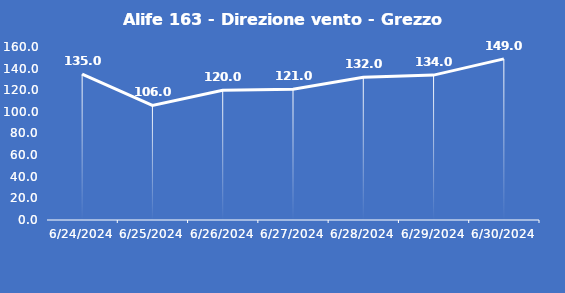
| Category | Alife 163 - Direzione vento - Grezzo (°N) |
|---|---|
| 6/24/24 | 135 |
| 6/25/24 | 106 |
| 6/26/24 | 120 |
| 6/27/24 | 121 |
| 6/28/24 | 132 |
| 6/29/24 | 134 |
| 6/30/24 | 149 |